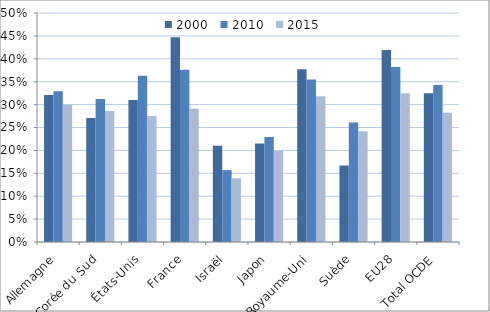
| Category | 2000 | 2010 | 2015 |
|---|---|---|---|
| Allemagne | 0.321 | 0.329 | 0.299 |
| Corée du Sud | 0.271 | 0.312 | 0.286 |
| États-Unis | 0.31 | 0.363 | 0.275 |
| France | 0.447 | 0.376 | 0.291 |
| Israël | 0.21 | 0.157 | 0.139 |
| Japon | 0.215 | 0.229 | 0.199 |
| Royaume-Uni | 0.377 | 0.355 | 0.318 |
| Suède | 0.167 | 0.261 | 0.242 |
| EU28 | 0.419 | 0.382 | 0.325 |
| Total OCDE | 0.325 | 0.343 | 0.282 |